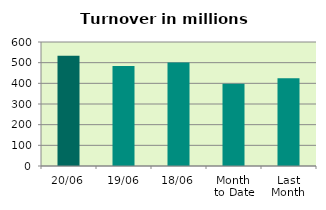
| Category | Series 0 |
|---|---|
| 20/06 | 533.749 |
| 19/06 | 483.959 |
| 18/06 | 501.074 |
| Month 
to Date | 398.555 |
| Last
Month | 424.091 |